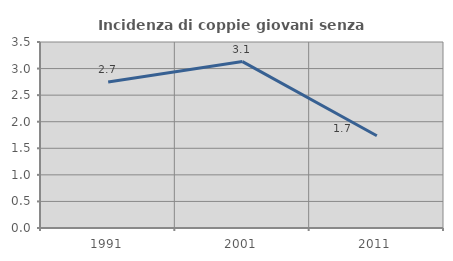
| Category | Incidenza di coppie giovani senza figli |
|---|---|
| 1991.0 | 2.746 |
| 2001.0 | 3.132 |
| 2011.0 | 1.736 |